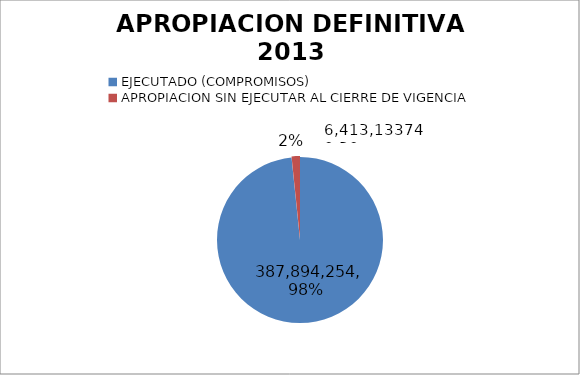
| Category | Series 0 |
|---|---|
| EJECUTADO (COMPROMISOS) | 387894254856.7 |
| APROPIACION SIN EJECUTAR AL CIERRE DE VIGENCIA | 6413133740.3 |